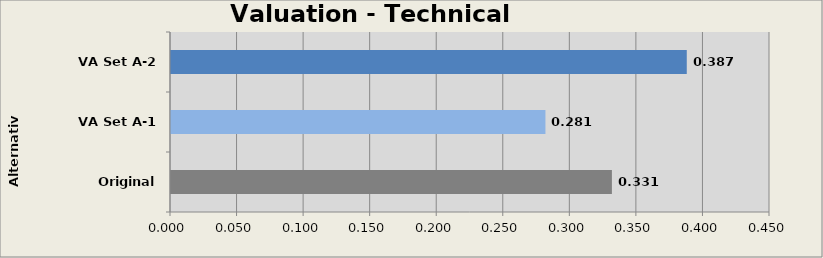
| Category | Valuation Social Module  |
|---|---|
| Original A-0 | 0.331 |
| VA Set A-1 | 0.281 |
| VA Set A-2 | 0.387 |